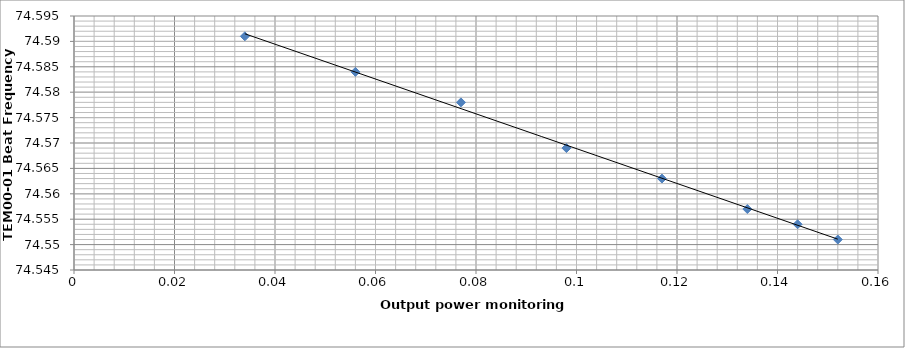
| Category | Series 0 |
|---|---|
| 0.152 | 74.551 |
| 0.144 | 74.554 |
| 0.134 | 74.557 |
| 0.117 | 74.563 |
| 0.098 | 74.569 |
| 0.077 | 74.578 |
| 0.056 | 74.584 |
| 0.034 | 74.591 |